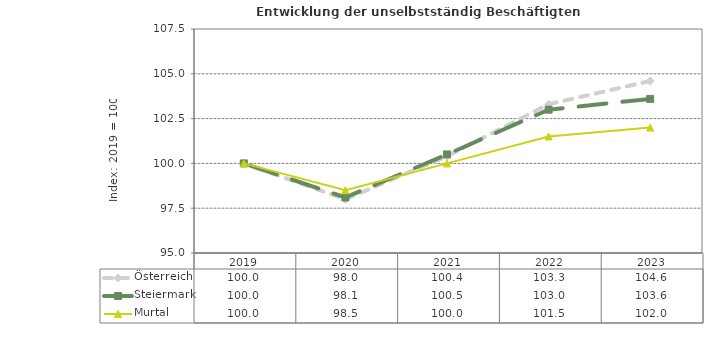
| Category | Österreich | Steiermark | Murtal |
|---|---|---|---|
| 2023.0 | 104.6 | 103.6 | 102 |
| 2022.0 | 103.3 | 103 | 101.5 |
| 2021.0 | 100.4 | 100.5 | 100 |
| 2020.0 | 98 | 98.1 | 98.5 |
| 2019.0 | 100 | 100 | 100 |